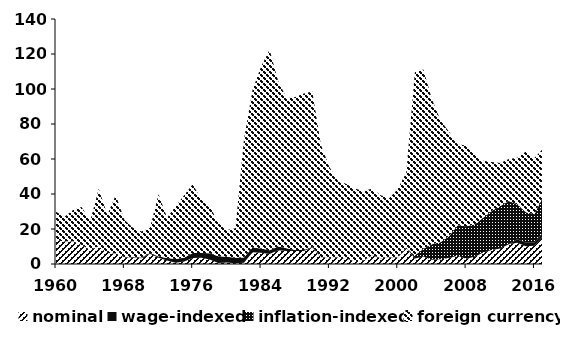
| Category | nominal | wage-indexed | inflation-indexed | foreign currency |
|---|---|---|---|---|
| 1960 | 13.388 | 0 | 0 | 16.456 |
| 1961 | 13.044 | 0 | 0 | 13.922 |
| 1962 | 13.005 | 0 | 0 | 17.887 |
| 1963 | 10.798 | 0 | 0 | 21.745 |
| 1964 | 7.929 | 0 | 0 | 16.647 |
| 1965 | 10.129 | 0 | 0 | 32.873 |
| 1966 | 6.343 | 0 | 0 | 21.814 |
| 1967 | 6.037 | 0 | 0 | 33.426 |
| 1968 | 3.868 | 0 | 0 | 21.364 |
| 1969 | 3.687 | 0.284 | 0 | 16.699 |
| 1970 | 3.321 | 0.448 | 0 | 14.768 |
| 1971 | 5.812 | 0.664 | 0 | 14.148 |
| 1972 | 3.61 | 0.605 | 0 | 35.64 |
| 1973 | 1.937 | 1.448 | 0 | 23.077 |
| 1974 | 0.735 | 2.182 | 0 | 30.03 |
| 1975 | 1.427 | 2.144 | 0 | 35.747 |
| 1976 | 3.477 | 2.822 | 0 | 39.252 |
| 1977 | 3.59 | 2.697 | 0 | 30.731 |
| 1978 | 2.635 | 3.548 | 0 | 27.019 |
| 1979 | 0.627 | 3.79 | 0 | 18.985 |
| 1980 | 0.802 | 3.32 | 0 | 15.363 |
| 1981 | 0.474 | 3.127 | 0 | 16.83 |
| 1982 | 0.721 | 2.989 | 0 | 67.533 |
| 1983 | 6.726 | 2.658 | 0 | 90.104 |
| 1984 | 6.443 | 2.387 | 0 | 104.045 |
| 1985 | 5.657 | 2.129 | 0 | 114.625 |
| 1986 | 7.897 | 2.148 | 0 | 94.474 |
| 1987 | 7.459 | 1.503 | 0 | 85.705 |
| 1988 | 7.494 | 0.547 | 0 | 87.425 |
| 1989 | 7.444 | 0.537 | 0 | 89.451 |
| 1990 | 9.386 | 0.49 | 0 | 88.752 |
| 1991 | 3.828 | 0.11 | 0 | 64.15 |
| 1992 | 3.278 | 0.092 | 0 | 52.013 |
| 1993 | 3.824 | 0.036 | 0 | 43.67 |
| 1994 | 3.003 | 0.03 | 0 | 42.693 |
| 1995 | 1.537 | 0.026 | 0 | 41.535 |
| 1996 | 1.981 | 0.028 | 0 | 39.543 |
| 1997 | 4.908 | 0.035 | 0 | 38.192 |
| 1998 | 3.357 | 0.052 | 0 | 35.891 |
| 1999 | 3.717 | 0.091 | 0 | 33.731 |
| 2000 | 3.576 | 0.15 | 0 | 39.093 |
| 2001 | 9.284 | 0.207 | 0 | 42.962 |
| 2002 | 3.148 | 0 | 1.715 | 104.716 |
| 2003 | 4.327 | 0 | 4.371 | 102.422 |
| 2004 | 2.358 | 0 | 8.958 | 82.764 |
| 2005 | 2.768 | 0 | 9.601 | 69.745 |
| 2006 | 3.385 | 0 | 12.46 | 59.786 |
| 2007 | 4.74 | 0 | 17.293 | 46.402 |
| 2008 | 2.975 | 0 | 18.655 | 46.097 |
| 2009 | 4.174 | 0 | 18.441 | 40.698 |
| 2010 | 6.576 | 0 | 19.804 | 32.688 |
| 2011 | 8.005 | 0 | 22.337 | 27.949 |
| 2012 | 8.815 | 0 | 24.34 | 24.565 |
| 2013 | 11.29 | 0 | 24.647 | 24.076 |
| 2014 | 12.159 | 1.95 | 19.93 | 26.705 |
| 2015 | 10.194 | 1.903 | 17.442 | 34.682 |
| 2016 | 10.387 | 1.857 | 16.156 | 32.116 |
| 2017 | 15.923 | 1.915 | 20.596 | 27.497 |